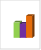
| Category |  област Хасково |
|---|---|
| летен сезон 2019  | 52195 |
| летен сезон 2021  | 47775 |
| летен сезон 2022 г.  | 74135 |